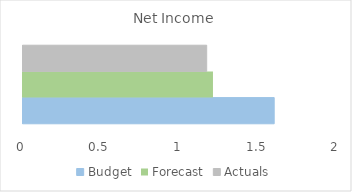
| Category | Budget | Forecast | Actuals |
|---|---|---|---|
| Net Income | 1.6 | 1.21 | 1.17 |